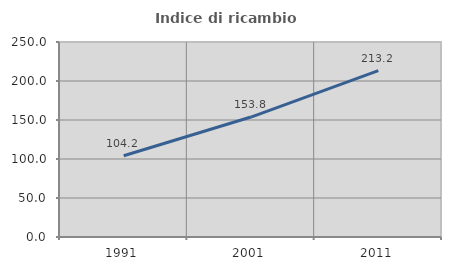
| Category | Indice di ricambio occupazionale  |
|---|---|
| 1991.0 | 104.19 |
| 2001.0 | 153.795 |
| 2011.0 | 213.249 |